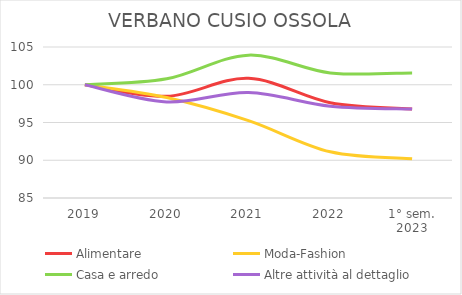
| Category | Alimentare | Moda-Fashion | Casa e arredo | Altre attività al dettaglio |
|---|---|---|---|---|
| 2019 | 100 | 100 | 100 | 100 |
| 2020 | 98.475 | 98.315 | 100.784 | 97.729 |
| 2021 | 100.847 | 95.253 | 103.922 | 98.959 |
| 2022 | 97.627 | 91.118 | 101.569 | 97.162 |
| 1° sem.
2023 | 96.78 | 90.199 | 101.569 | 96.783 |